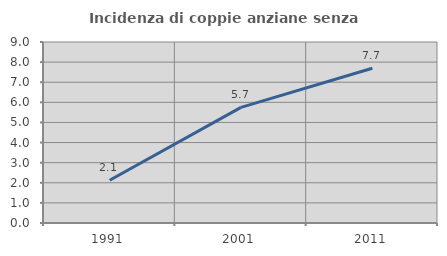
| Category | Incidenza di coppie anziane senza figli  |
|---|---|
| 1991.0 | 2.128 |
| 2001.0 | 5.747 |
| 2011.0 | 7.692 |